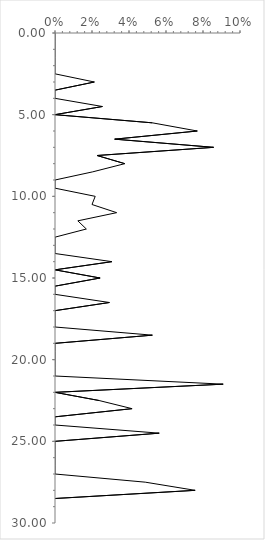
| Category | Series 0 |
|---|---|
| 0.0 | 0 |
| 0.0 | 0.5 |
| 0.0 | 1 |
| 0.0 | 1.5 |
| 0.0 | 2 |
| 0.0 | 2.5 |
| 0.02127659574468085 | 3 |
| 0.0 | 3.5 |
| 0.0 | 4 |
| 0.02564102564102564 | 4.5 |
| 0.0 | 5 |
| 0.05263157894736842 | 5.5 |
| 0.07692307692307693 | 6 |
| 0.03225806451612903 | 6.5 |
| 0.08571428571428572 | 7 |
| 0.022727272727272728 | 7.5 |
| 0.03773584905660377 | 8 |
| 0.02040816326530612 | 8.5 |
| 0.0 | 9 |
| 0.0 | 9.5 |
| 0.021739130434782608 | 10 |
| 0.02 | 10.5 |
| 0.03333333333333333 | 11 |
| 0.012345679012345678 | 11.5 |
| 0.01694915254237288 | 12 |
| 0.0 | 12.5 |
| 0.0 | 13 |
| 0.0 | 13.5 |
| 0.03076923076923077 | 14 |
| 0.0 | 14.5 |
| 0.024390243902439025 | 15 |
| 0.0 | 15.5 |
| 0.0 | 16 |
| 0.029411764705882353 | 16.5 |
| 0.0 | 17 |
| 0.0 | 17.5 |
| 0.0 | 18 |
| 0.05263157894736842 | 18.5 |
| 0.0 | 19 |
| 0.0 | 19.5 |
| 0.0 | 20 |
| 0.0 | 20.5 |
| 0.0 | 21 |
| 0.09090909090909091 | 21.5 |
| 0.0 | 22 |
| 0.023809523809523808 | 22.5 |
| 0.041666666666666664 | 23 |
| 0.0 | 23.5 |
| 0.0 | 24 |
| 0.056338028169014086 | 24.5 |
| 0.0 | 25 |
| 0.0 | 25.5 |
| 0.0 | 26 |
| 0.0 | 26.5 |
| 0.0 | 27 |
| 0.04878048780487805 | 27.5 |
| 0.07575757575757576 | 28 |
| 0.0 | 28.5 |